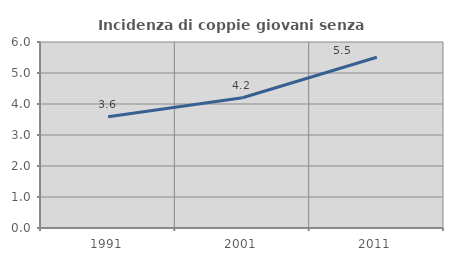
| Category | Incidenza di coppie giovani senza figli |
|---|---|
| 1991.0 | 3.586 |
| 2001.0 | 4.203 |
| 2011.0 | 5.509 |